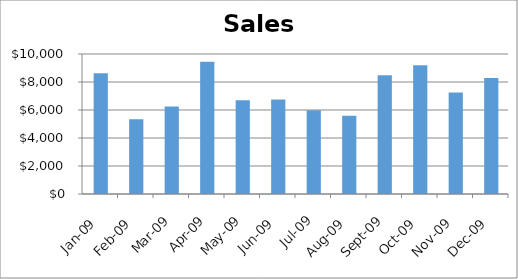
| Category | Sales |
|---|---|
| 2009-01-01 | 8627 |
| 2009-02-01 | 5343 |
| 2009-03-01 | 6244 |
| 2009-04-01 | 9451 |
| 2009-05-01 | 6698 |
| 2009-06-01 | 6752 |
| 2009-07-01 | 5985 |
| 2009-08-01 | 5586 |
| 2009-09-01 | 8476 |
| 2009-10-01 | 9191 |
| 2009-11-01 | 7242 |
| 2009-12-01 | 8277 |